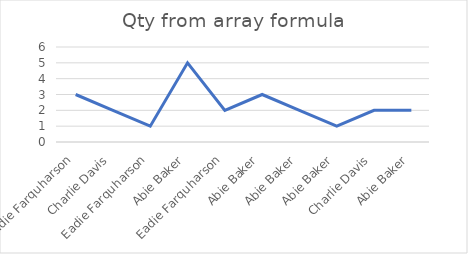
| Category | Qty from array |
|---|---|
| Eadie Farquharson | 3 |
| Charlie Davis | 2 |
| Eadie Farquharson | 1 |
| Abie Baker | 5 |
| Eadie Farquharson | 2 |
| Abie Baker | 3 |
| Abie Baker | 2 |
| Abie Baker | 1 |
| Charlie Davis | 2 |
| Abie Baker | 2 |